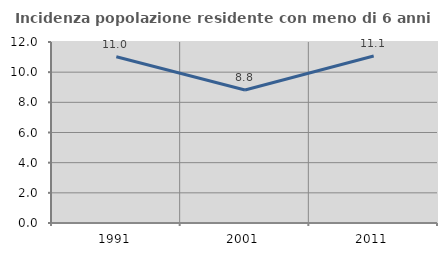
| Category | Incidenza popolazione residente con meno di 6 anni |
|---|---|
| 1991.0 | 11.019 |
| 2001.0 | 8.822 |
| 2011.0 | 11.074 |